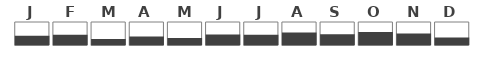
| Category | Dummy100Pct | Series 0 |
|---|---|---|
| 0 |  | 0.401 |
| 1 |  | 0.447 |
| 2 |  | 0.257 |
| 3 |  | 0.369 |
| 4 |  | 0.303 |
| 5 |  | 0.457 |
| 6 |  | 0.45 |
| 7 |  | 0.543 |
| 8 |  | 0.464 |
| 9 |  | 0.57 |
| 10 |  | 0.499 |
| 11 |  | 0.321 |